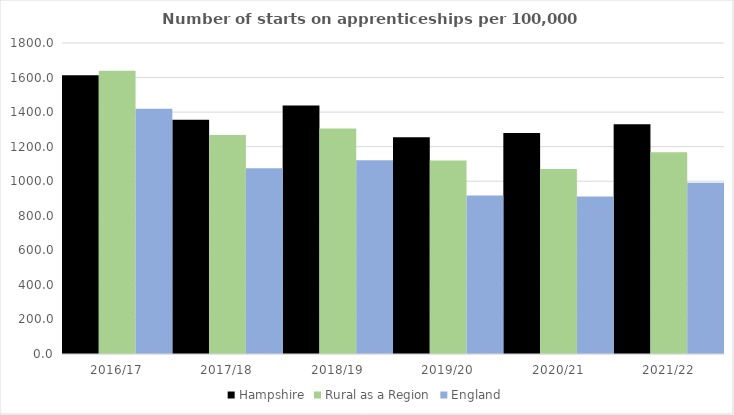
| Category | Hampshire | Rural as a Region | England |
|---|---|---|---|
| 2016/17 | 1613.836 | 1638.789 | 1420 |
| 2017/18 | 1355.545 | 1267.474 | 1075 |
| 2018/19 | 1438.172 | 1304.57 | 1122 |
| 2019/20 | 1254.239 | 1119.662 | 918 |
| 2020/21 | 1278.585 | 1070.748 | 912 |
| 2021/22 | 1329.715 | 1167.68 | 991 |